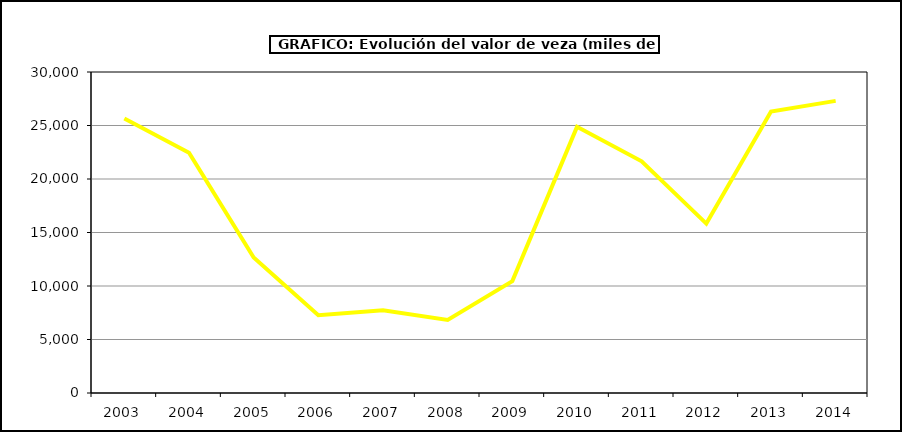
| Category | Valor |
|---|---|
| 2003.0 | 25657.578 |
| 2004.0 | 22460.293 |
| 2005.0 | 12656.801 |
| 2006.0 | 7266.675 |
| 2007.0 | 7737.806 |
| 2008.0 | 6819.132 |
| 2009.0 | 10457.841 |
| 2010.0 | 24873.072 |
| 2011.0 | 21651.853 |
| 2012.0 | 15834 |
| 2013.0 | 26306.52 |
| 2014.0 | 27301.452 |